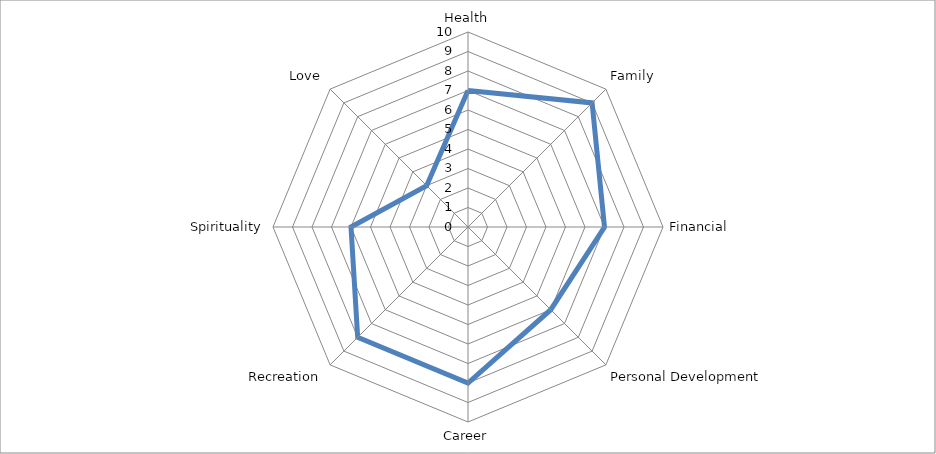
| Category | Series 0 |
|---|---|
| Health | 7 |
| Family | 9 |
| Financial | 7 |
| Personal Development | 6 |
| Career | 8 |
| Recreation | 8 |
| Spirituality | 6 |
| Love | 3 |